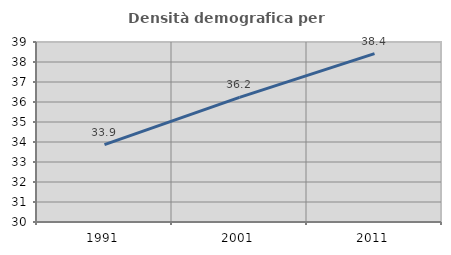
| Category | Densità demografica |
|---|---|
| 1991.0 | 33.87 |
| 2001.0 | 36.228 |
| 2011.0 | 38.422 |